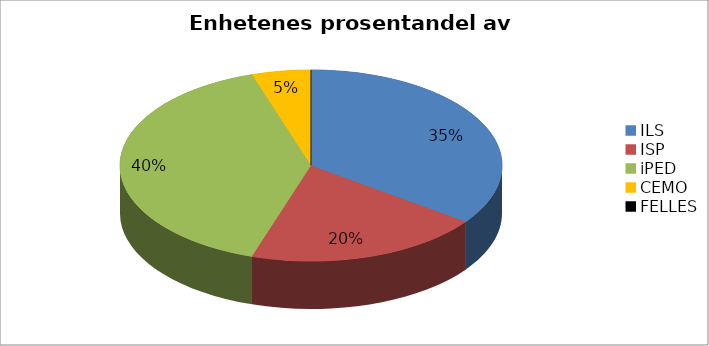
| Category | Series 0 |
|---|---|
| ILS | 3076500 |
| ISP | 1758000 |
| iPED | 3516000 |
| CEMO | 439500 |
| FELLES | 0 |